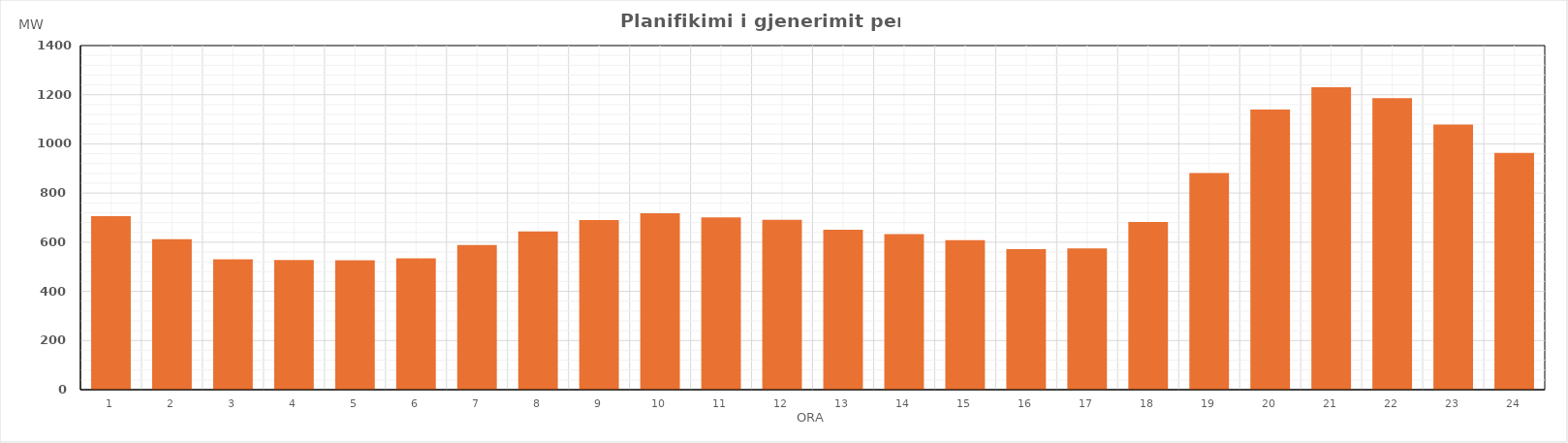
| Category | Max (MW) |
|---|---|
| 0 | 706.08 |
| 1 | 612.3 |
| 2 | 530.36 |
| 3 | 527.66 |
| 4 | 526.81 |
| 5 | 534.63 |
| 6 | 588.12 |
| 7 | 643.47 |
| 8 | 689.86 |
| 9 | 717.44 |
| 10 | 701.42 |
| 11 | 691.33 |
| 12 | 650.33 |
| 13 | 632.95 |
| 14 | 608.57 |
| 15 | 571.94 |
| 16 | 574.4 |
| 17 | 681.79 |
| 18 | 881.68 |
| 19 | 1140.06 |
| 20 | 1230.62 |
| 21 | 1185.63 |
| 22 | 1078.49 |
| 23 | 962.76 |